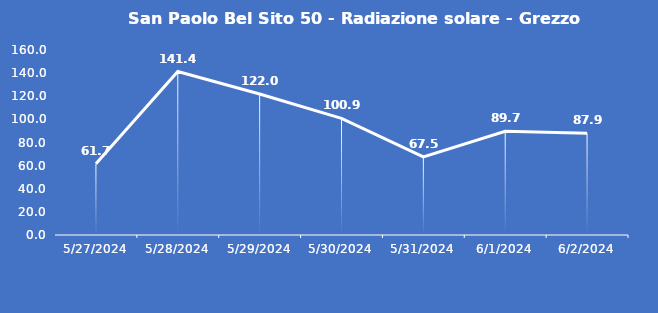
| Category | San Paolo Bel Sito 50 - Radiazione solare - Grezzo (W/m2) |
|---|---|
| 5/27/24 | 61.7 |
| 5/28/24 | 141.4 |
| 5/29/24 | 122 |
| 5/30/24 | 100.9 |
| 5/31/24 | 67.5 |
| 6/1/24 | 89.7 |
| 6/2/24 | 87.9 |